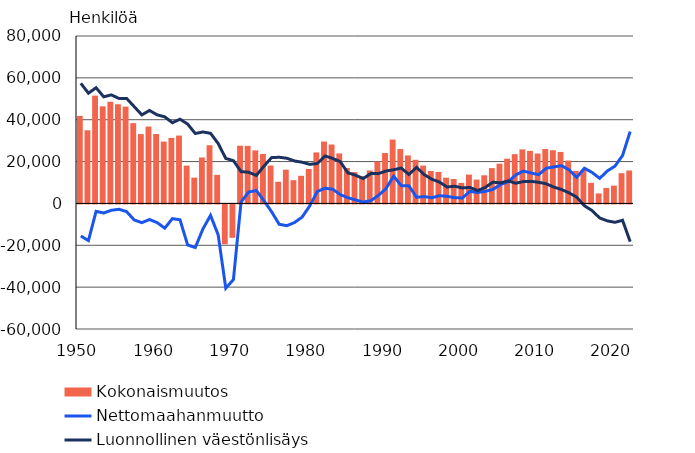
| Category | Kokonaismuutos |
|---|---|
| 1950.0 | 41807 |
| 1951.0 | 34924 |
| 1952.0 | 51501 |
| 1953.0 | 46381 |
| 1954.0 | 48582 |
| 1955.0 | 47380 |
| 1956.0 | 46261 |
| 1957.0 | 38358 |
| 1958.0 | 33124 |
| 1959.0 | 36732 |
| 1960.0 | 33176 |
| 1961.0 | 29565 |
| 1962.0 | 31311 |
| 1963.0 | 32421 |
| 1964.0 | 18048 |
| 1965.0 | 12329 |
| 1966.0 | 21946 |
| 1967.0 | 27803 |
| 1968.0 | 13647 |
| 1969.0 | -19015 |
| 1970.0 | -15941 |
| 1971.0 | 27576 |
| 1972.0 | 27489 |
| 1973.0 | 25360 |
| 1974.0 | 23626 |
| 1975.0 | 18105 |
| 1976.0 | 10344 |
| 1977.0 | 16131 |
| 1978.0 | 11121 |
| 1979.0 | 13204 |
| 1980.0 | 16486 |
| 1981.0 | 24372 |
| 1982.0 | 29565 |
| 1983.0 | 28143 |
| 1984.0 | 23890 |
| 1985.0 | 16916 |
| 1986.0 | 14980 |
| 1987.0 | 12958 |
| 1988.0 | 15757 |
| 1989.0 | 20024 |
| 1990.0 | 24095 |
| 1991.0 | 30524 |
| 1992.0 | 25980 |
| 1993.0 | 22930 |
| 1994.0 | 20842 |
| 1995.0 | 18072 |
| 1996.0 | 15494 |
| 1997.0 | 15029 |
| 1998.0 | 12297 |
| 1999.0 | 11656 |
| 2000.0 | 9813 |
| 2001.0 | 13786 |
| 2002.0 | 11394 |
| 2003.0 | 13437 |
| 2004.0 | 16879 |
| 2005.0 | 18969 |
| 2006.0 | 21375 |
| 2007.0 | 23529 |
| 2008.0 | 25830 |
| 2009.0 | 25113 |
| 2010.0 | 23849 |
| 2011.0 | 25991 |
| 2012.0 | 25407 |
| 2013.0 | 24596 |
| 2014.0 | 20483 |
| 2015.0 | 15555 |
| 2016.0 | 15989 |
| 2017.0 | 9833 |
| 2018.0 | 4789 |
| 2019.0 | 7373 |
| 2020.0 | 8501 |
| 2021.0 | 14448 |
| 2022.0 | 15729 |